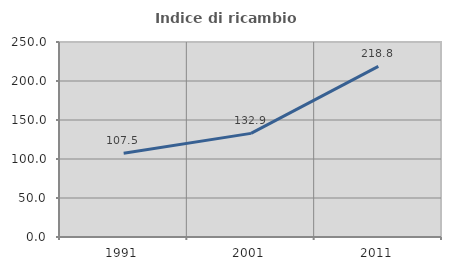
| Category | Indice di ricambio occupazionale  |
|---|---|
| 1991.0 | 107.463 |
| 2001.0 | 132.857 |
| 2011.0 | 218.841 |